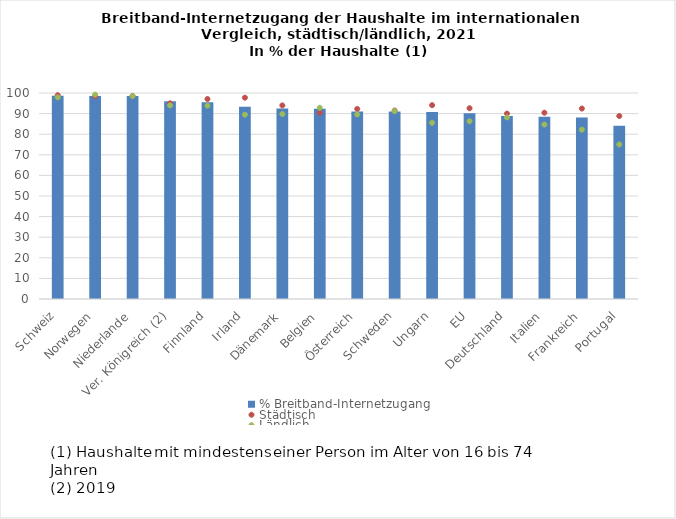
| Category | % Breitband-Internetzugang |
|---|---|
| Schweiz | 98.673 |
| Norwegen | 98.601 |
| Niederlande | 98.557 |
| Ver. Königreich (2) | 96 |
| Finnland | 95.475 |
| Irland | 93.349 |
| Dänemark | 92.466 |
| Belgien | 92.3 |
| Österreich | 91.009 |
| Schweden | 90.963 |
| Ungarn | 90.781 |
| EU | 90.211 |
| Deutschland | 88.838 |
| Italien | 88.488 |
| Frankreich | 88.114 |
| Portugal | 84.104 |